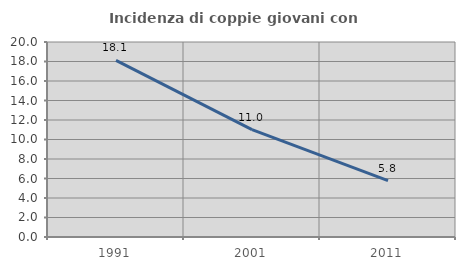
| Category | Incidenza di coppie giovani con figli |
|---|---|
| 1991.0 | 18.119 |
| 2001.0 | 11.014 |
| 2011.0 | 5.779 |